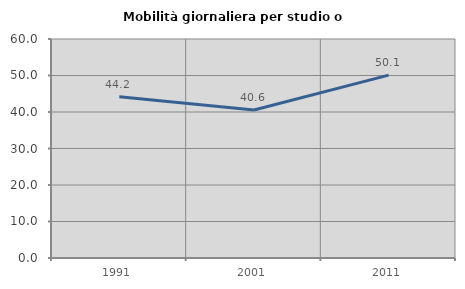
| Category | Mobilità giornaliera per studio o lavoro |
|---|---|
| 1991.0 | 44.17 |
| 2001.0 | 40.56 |
| 2011.0 | 50.098 |